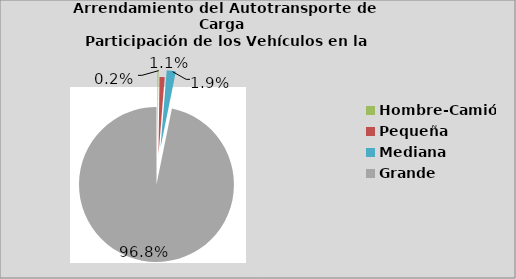
| Category | Series 0 |
|---|---|
| Hombre-Camión | 0.202 |
| Pequeña | 1.077 |
| Mediana | 1.901 |
| Grande | 96.82 |